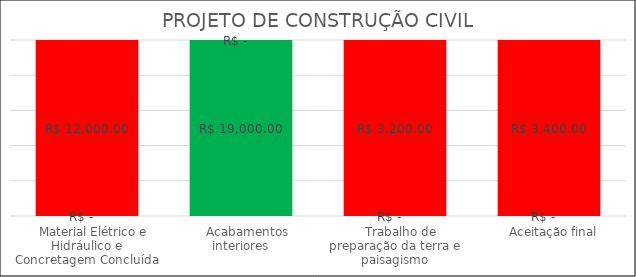
| Category | Barra Verde | Barra Vermelha |
|---|---|---|
|    Material Elétrico e Hidráulico e Concretagem Concluída | 0 | 12000 |
|    Acabamentos interiores | 19000 | 0 |
|    Trabalho de preparação da terra e paisagismo | 0 | 3200 |
|    Aceitação final | 0 | 3400 |